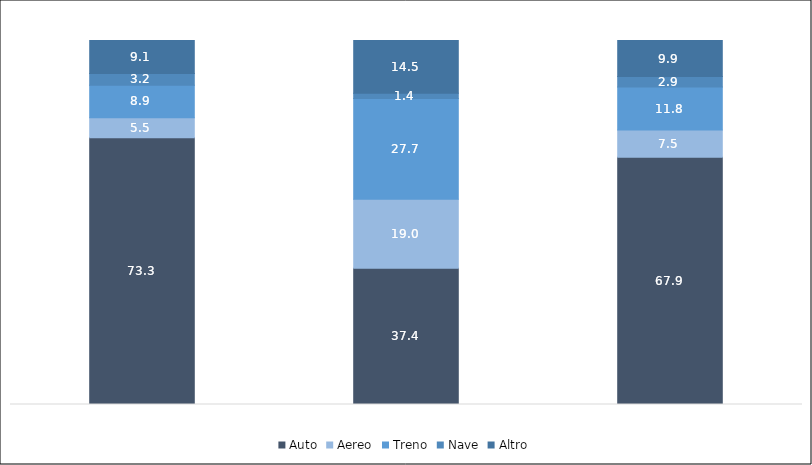
| Category | Auto | Aereo | Treno | Nave | Altro |
|---|---|---|---|---|---|
| VACANZA | 73.3 | 5.5 | 8.9 | 3.2 | 9.1 |
| LAVORO | 37.4 | 19 | 27.7 | 1.4 | 14.5 |
| TOTALE | 67.9 | 7.5 | 11.8 | 2.9 | 9.9 |